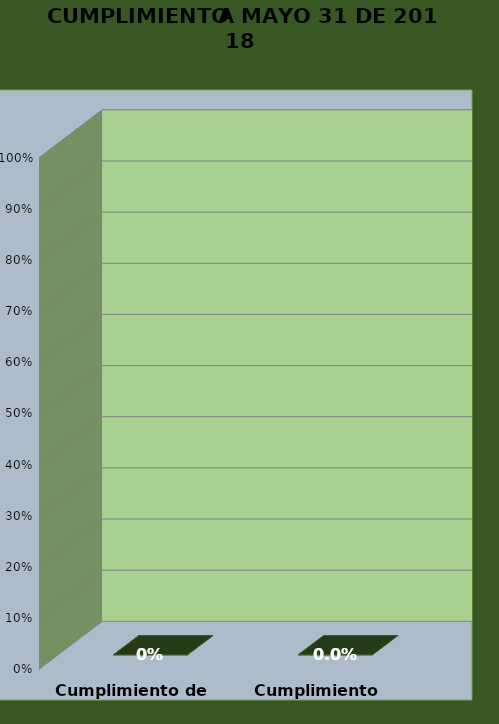
| Category | 30-may.-18 |
|---|---|
| Cumplimiento de Hitos | 0 |
| Cumplimiento Temporal | 0 |